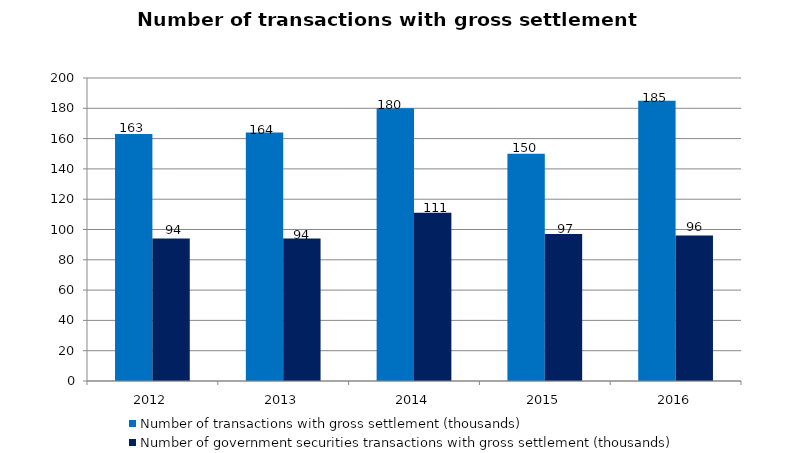
| Category | Number of transactions with gross settlement (thousands) | Number of government securities transactions with gross settlement (thousands) |
|---|---|---|
| 2012.0 | 163 | 94 |
| 2013.0 | 164 | 94 |
| 2014.0 | 180 | 111 |
| 2015.0 | 150 | 97 |
| 2016.0 | 185 | 96 |